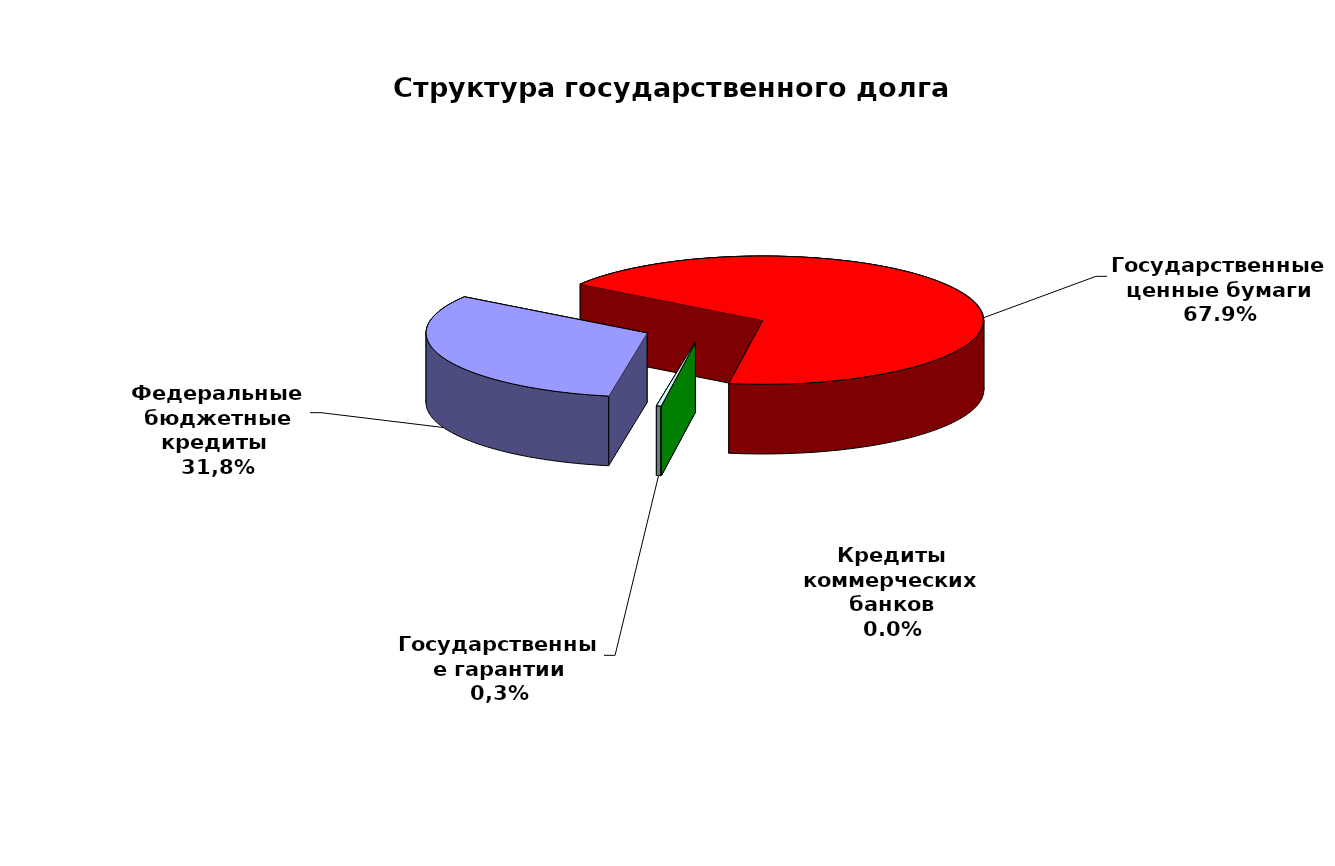
| Category | Series 0 |
|---|---|
| Федеральные бюджетные кредиты  | 19957026.213 |
| Государственные ценные бумаги | 42700000 |
| Кредиты коммерческих банков | 0 |
| Государственные гарантии | 200735.86 |